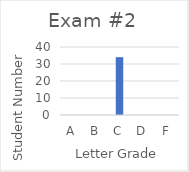
| Category | Series 0 |
|---|---|
| A | 0 |
| B | 0 |
| C | 34 |
| D | 0 |
| F | 0 |